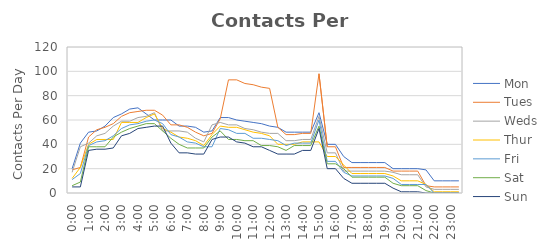
| Category | Mon | Tues | Weds | Thur | Fri | Sat | Sun |
|---|---|---|---|---|---|---|---|
| 0.0 | 20 | 19 | 17 | 12 | 11 | 6 | 5 |
| 0.020833333333333332 | 41 | 21 | 38 | 21 | 16 | 9 | 5 |
| 0.041666666666666664 | 50 | 46 | 41 | 40 | 39 | 38 | 35 |
| 0.0625 | 51 | 52 | 47 | 44 | 42 | 38 | 36 |
| 0.0833333333333333 | 55 | 54 | 49 | 44 | 43 | 38 | 36 |
| 0.104166666666667 | 62 | 57 | 55 | 44 | 47 | 46 | 37 |
| 0.125 | 65 | 63 | 59 | 58 | 53 | 50 | 47 |
| 0.145833333333333 | 69 | 66 | 59 | 58 | 56 | 53 | 49 |
| 0.166666666666667 | 70 | 67 | 62 | 58 | 57 | 55 | 53 |
| 0.1875 | 65 | 68 | 63 | 62 | 59 | 57 | 54 |
| 0.208333333333333 | 60 | 68 | 66 | 65 | 60 | 57 | 55 |
| 0.229166666666667 | 60 | 64 | 51 | 53 | 57 | 51 | 55 |
| 0.25 | 60 | 56 | 51 | 50 | 48 | 45 | 41 |
| 0.270833333333333 | 55 | 56 | 51 | 46 | 46 | 40 | 33 |
| 0.291666666666667 | 55 | 54 | 50 | 45 | 42 | 37 | 33 |
| 0.3125 | 54 | 50 | 45 | 43 | 41 | 37 | 32 |
| 0.333333333333333 | 50 | 47 | 42 | 39 | 38 | 37 | 32 |
| 0.354166666666667 | 51 | 49 | 56 | 48 | 38 | 46 | 44 |
| 0.375 | 62 | 61 | 58 | 55 | 53 | 51 | 46 |
| 0.395833333333333 | 62 | 93 | 56 | 54 | 52 | 44 | 46 |
| 0.416666666666667 | 60 | 93 | 56 | 54 | 49 | 44 | 42 |
| 0.4375 | 59 | 90 | 53 | 52 | 49 | 43 | 41 |
| 0.458333333333333 | 58 | 89 | 52 | 50 | 45 | 43 | 38 |
| 0.479166666666667 | 57 | 87 | 50 | 49 | 45 | 39 | 38 |
| 0.5 | 55 | 86 | 49 | 47 | 44 | 39 | 35 |
| 0.520833333333333 | 54 | 54 | 49 | 40 | 43 | 38 | 32 |
| 0.541666666666667 | 50 | 48 | 43 | 40 | 39 | 35 | 32 |
| 0.5625 | 50 | 48 | 43 | 40 | 41 | 39 | 32 |
| 0.583333333333333 | 50 | 49 | 44 | 42 | 41 | 39 | 35 |
| 0.604166666666667 | 50 | 49 | 44 | 42 | 41 | 39 | 35 |
| 0.625 | 66 | 98 | 63 | 42 | 60 | 55 | 53 |
| 0.645833333333333 | 40 | 38 | 33 | 30 | 26 | 24 | 20 |
| 0.666666666666667 | 40 | 38 | 33 | 30 | 26 | 24 | 20 |
| 0.6875 | 30 | 21 | 18 | 23 | 17 | 20 | 12 |
| 0.708333333333333 | 25 | 21 | 18 | 16 | 14 | 13 | 8 |
| 0.729166666666667 | 25 | 21 | 18 | 16 | 14 | 13 | 8 |
| 0.75 | 25 | 21 | 18 | 16 | 14 | 13 | 8 |
| 0.770833333333333 | 25 | 21 | 18 | 16 | 14 | 13 | 8 |
| 0.791666666666667 | 25 | 21 | 18 | 16 | 14 | 13 | 8 |
| 0.8125 | 20 | 18 | 17 | 14 | 12 | 8 | 4 |
| 0.833333333333333 | 20 | 18 | 15 | 10 | 7 | 6 | 1 |
| 0.854166666666667 | 20 | 18 | 15 | 10 | 7 | 6 | 1 |
| 0.875 | 20 | 18 | 15 | 10 | 7 | 6 | 1 |
| 0.895833333333333 | 19 | 6 | 5 | 7 | 7 | 2 | 0 |
| 0.916666666666667 | 10 | 5 | 3 | 1 | 0 | 0 | 0 |
| 0.9375 | 10 | 5 | 3 | 1 | 0 | 0 | 0 |
| 0.958333333333333 | 10 | 5 | 3 | 1 | 0 | 0 | 0 |
| 0.979166666666667 | 10 | 5 | 3 | 1 | 0 | 0 | 0 |